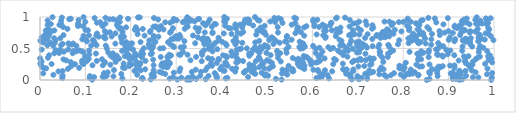
| Category | Series 0 |
|---|---|
| 0.8517453043884555 | 0.001 |
| 0.993865788818756 | 0.002 |
| 0.92421928301429 | 0.003 |
| 0.11494246304169853 | 0.004 |
| 0.3285292895966484 | 0.005 |
| 0.5321813494685641 | 0.006 |
| 0.3229325201346477 | 0.007 |
| 0.302608369958298 | 0.008 |
| 0.24389420201860312 | 0.009 |
| 0.33215628549919063 | 0.01 |
| 0.6871110966097197 | 0.011 |
| 0.9302765382753684 | 0.012 |
| 0.3648677871262077 | 0.013 |
| 0.7031395950889501 | 0.014 |
| 0.9167529244467799 | 0.015 |
| 0.3437675871711281 | 0.016 |
| 0.8578641617673483 | 0.017 |
| 0.909330148688486 | 0.018 |
| 0.5196457296687454 | 0.019 |
| 0.7206491587617166 | 0.02 |
| 0.22575723154965877 | 0.021 |
| 0.7004841224084475 | 0.022 |
| 0.28545039676317974 | 0.023 |
| 0.6859710154661992 | 0.024 |
| 0.40898410668095664 | 0.025 |
| 0.6366075065044474 | 0.026 |
| 0.18144309309771067 | 0.027 |
| 0.2253442996594589 | 0.028 |
| 0.3266540526623384 | 0.029 |
| 0.22532012384857325 | 0.03 |
| 0.04909111847365333 | 0.031 |
| 0.6089509980509238 | 0.032 |
| 0.10944485526205705 | 0.033 |
| 0.7081152089598097 | 0.034 |
| 0.41265247078994116 | 0.035 |
| 0.326502487703038 | 0.036 |
| 0.31155835153600264 | 0.037 |
| 0.3900845507603692 | 0.038 |
| 0.9951365960320512 | 0.039 |
| 0.7000949159336126 | 0.04 |
| 0.9656442115044974 | 0.041 |
| 0.2932435445535486 | 0.042 |
| 0.9097209442566069 | 0.043 |
| 0.953526477979759 | 0.044 |
| 0.6154370346867435 | 0.045 |
| 0.11921774569219423 | 0.046 |
| 0.4583504453000835 | 0.047 |
| 0.38874175025968705 | 0.048 |
| 0.9092881677238172 | 0.049 |
| 0.14197114880470418 | 0.05 |
| 0.8015277027395885 | 0.051 |
| 0.1379742821688561 | 0.052 |
| 0.7631484658734377 | 0.053 |
| 0.6215446508254242 | 0.054 |
| 0.3362144057127442 | 0.055 |
| 0.25137238048844224 | 0.056 |
| 0.6832175226085327 | 0.057 |
| 0.16176303529499425 | 0.058 |
| 0.9153271086545628 | 0.059 |
| 0.04939699108425355 | 0.06 |
| 0.6991657838963681 | 0.061 |
| 0.10992623036283078 | 0.062 |
| 0.8757834314876418 | 0.063 |
| 0.37122003114018576 | 0.064 |
| 0.14666623247337784 | 0.065 |
| 0.9383055412388116 | 0.066 |
| 0.35292586224719247 | 0.067 |
| 0.5025105134567361 | 0.068 |
| 0.24765535994239163 | 0.069 |
| 0.49556725616449626 | 0.07 |
| 0.04963036342068994 | 0.071 |
| 0.8331053564657009 | 0.072 |
| 0.38855071208946657 | 0.073 |
| 0.7726529252482564 | 0.074 |
| 0.6836705415293377 | 0.075 |
| 0.9164078356537823 | 0.076 |
| 0.6333871359024557 | 0.077 |
| 0.9214349944376365 | 0.078 |
| 0.6193285089730441 | 0.079 |
| 0.7582664450957158 | 0.08 |
| 0.8337066675031387 | 0.081 |
| 0.02945636184849587 | 0.082 |
| 0.21404832447852962 | 0.083 |
| 0.7214362234436708 | 0.084 |
| 0.5445885781950225 | 0.085 |
| 0.7945553811251855 | 0.086 |
| 0.2459135148980186 | 0.087 |
| 0.8065434694518768 | 0.088 |
| 0.49801356042071176 | 0.089 |
| 0.7473919147595646 | 0.09 |
| 0.6820197896780943 | 0.091 |
| 0.9845888788939088 | 0.092 |
| 0.9266204216189156 | 0.093 |
| 0.8143037410660731 | 0.094 |
| 0.17913733900560536 | 0.095 |
| 0.2757149401635759 | 0.096 |
| 0.4741672761175343 | 0.097 |
| 0.623556885583387 | 0.098 |
| 0.6742327299339196 | 0.099 |
| 0.7163947268998733 | 0.1 |
| 0.858798388194862 | 0.101 |
| 0.8206473603723144 | 0.102 |
| 0.90474743954678 | 0.103 |
| 0.5328401438740826 | 0.104 |
| 0.0069907391539003605 | 0.105 |
| 0.4717456545098735 | 0.106 |
| 0.8117565405555062 | 0.107 |
| 0.7797079850323674 | 0.108 |
| 0.1410349163908866 | 0.109 |
| 0.3850093604360786 | 0.11 |
| 0.9958022682757366 | 0.111 |
| 0.25076016268575607 | 0.112 |
| 0.2688574653285526 | 0.113 |
| 0.4883384171491766 | 0.114 |
| 0.8748438480139572 | 0.115 |
| 0.536447011978435 | 0.116 |
| 0.2947447035333367 | 0.117 |
| 0.7287263575406195 | 0.118 |
| 0.45003939600097687 | 0.119 |
| 0.9090856752959029 | 0.12 |
| 0.14923186142259504 | 0.121 |
| 0.449099533680383 | 0.122 |
| 0.959530948792269 | 0.123 |
| 0.9259103211263985 | 0.124 |
| 0.8571197183514976 | 0.125 |
| 0.8252122234316427 | 0.126 |
| 0.334516466980018 | 0.127 |
| 0.7337987593767781 | 0.128 |
| 0.26376134649312966 | 0.129 |
| 0.3546446994677328 | 0.13 |
| 0.4658407327462296 | 0.131 |
| 0.7251796242352492 | 0.132 |
| 0.6134232663272333 | 0.133 |
| 0.4299943990891284 | 0.134 |
| 0.9232718291191485 | 0.135 |
| 0.04060039866555276 | 0.136 |
| 0.30723595647312485 | 0.137 |
| 0.6435875162381278 | 0.138 |
| 0.5579698461319373 | 0.139 |
| 0.5554950924025235 | 0.14 |
| 0.6900779902654501 | 0.141 |
| 0.049779985027784246 | 0.142 |
| 0.9371118064537067 | 0.143 |
| 0.45306018827701733 | 0.144 |
| 0.40631409173471156 | 0.145 |
| 0.20827281256735297 | 0.146 |
| 0.9241893031351218 | 0.147 |
| 0.8746863226148994 | 0.148 |
| 0.4038634629540728 | 0.149 |
| 0.9512623776802573 | 0.15 |
| 0.7252678734355699 | 0.151 |
| 0.21048445975838714 | 0.152 |
| 0.22200347781933316 | 0.153 |
| 0.25023603087060065 | 0.154 |
| 0.6276530638252004 | 0.155 |
| 0.3646315067168018 | 0.156 |
| 0.7477093217544335 | 0.157 |
| 0.16297072428352832 | 0.158 |
| 0.6119008932091055 | 0.159 |
| 0.5434199388751852 | 0.16 |
| 0.6701138072761015 | 0.161 |
| 0.800762514751559 | 0.162 |
| 0.6021972131502253 | 0.163 |
| 0.342995433480931 | 0.164 |
| 0.5340914158019616 | 0.165 |
| 0.8166658459910288 | 0.166 |
| 0.6902273949085764 | 0.167 |
| 0.6755579696268829 | 0.168 |
| 0.7568471383203016 | 0.169 |
| 0.23179771321626697 | 0.17 |
| 0.6676091282195278 | 0.171 |
| 0.863855125046963 | 0.172 |
| 0.5565223807049762 | 0.173 |
| 0.39696131348305963 | 0.174 |
| 0.5821528847675291 | 0.175 |
| 0.46071057344700217 | 0.176 |
| 0.061534768893486635 | 0.177 |
| 0.42297785597279514 | 0.178 |
| 0.5046006350390657 | 0.179 |
| 0.9857272787058831 | 0.18 |
| 0.47257174712908634 | 0.181 |
| 0.49434978549856323 | 0.182 |
| 0.30902205041318853 | 0.183 |
| 0.8750371583140831 | 0.184 |
| 0.013658743605752921 | 0.185 |
| 0.7914732308922076 | 0.186 |
| 0.4320449073057687 | 0.187 |
| 0.008970724156752485 | 0.188 |
| 0.18664617545825268 | 0.189 |
| 0.2142968059949657 | 0.19 |
| 0.46145617773425374 | 0.191 |
| 0.08614549029059448 | 0.192 |
| 0.9129897474972999 | 0.193 |
| 0.47066706704100625 | 0.194 |
| 0.9478014455350394 | 0.195 |
| 0.4705591925378666 | 0.196 |
| 0.8028442840359784 | 0.197 |
| 0.18250545812799612 | 0.198 |
| 0.5765085353361644 | 0.199 |
| 0.7517067691414523 | 0.2 |
| 0.8814035605255347 | 0.201 |
| 0.3687697347786577 | 0.202 |
| 0.2795042117843559 | 0.203 |
| 0.4830280090182404 | 0.204 |
| 0.8809661852977303 | 0.205 |
| 0.5089372409821162 | 0.206 |
| 0.28127939402459523 | 0.207 |
| 0.27181629159929255 | 0.208 |
| 0.004598876051149836 | 0.209 |
| 0.399539586434713 | 0.21 |
| 0.4674678691483706 | 0.211 |
| 0.7984328466401487 | 0.212 |
| 0.8777590887496296 | 0.213 |
| 0.8358174798540239 | 0.214 |
| 0.7013743023642558 | 0.215 |
| 0.8416994434721975 | 0.216 |
| 0.06808269980572523 | 0.217 |
| 0.5130658117684528 | 0.218 |
| 0.5712432642789642 | 0.219 |
| 0.8871211925144941 | 0.22 |
| 0.9121659937714616 | 0.221 |
| 0.7143595076368432 | 0.222 |
| 0.19626892979918698 | 0.223 |
| 0.5475687565175202 | 0.224 |
| 0.3789292357138778 | 0.225 |
| 0.7915863194293621 | 0.226 |
| 0.4131434930642154 | 0.227 |
| 0.2671809423657181 | 0.228 |
| 0.9032649993850639 | 0.229 |
| 0.5826253389041661 | 0.23 |
| 0.9129649838336187 | 0.231 |
| 0.4696184523479181 | 0.232 |
| 0.11559074025231886 | 0.233 |
| 0.13832272240999632 | 0.234 |
| 0.2503018072698795 | 0.235 |
| 0.21918901910211797 | 0.236 |
| 0.1996426505013973 | 0.237 |
| 0.9437285865101503 | 0.238 |
| 0.001954564240659873 | 0.239 |
| 0.7271649788096826 | 0.24 |
| 0.40937883242637085 | 0.241 |
| 0.15508482605915375 | 0.242 |
| 0.9525263688978476 | 0.243 |
| 0.8291384162325475 | 0.244 |
| 0.597572800242674 | 0.245 |
| 0.4613406260756546 | 0.246 |
| 0.8578637751291933 | 0.247 |
| 0.2104049132093816 | 0.248 |
| 0.4889884984842596 | 0.249 |
| 0.213509863218746 | 0.25 |
| 0.07696959060780717 | 0.251 |
| 0.645933380431601 | 0.252 |
| 0.09566569589454599 | 0.253 |
| 0.025508172362300408 | 0.254 |
| 0.7300824875511148 | 0.255 |
| 0.9804822579056163 | 0.256 |
| 0.5676952590257902 | 0.257 |
| 0.37663205889677576 | 0.258 |
| 0.6670929569891763 | 0.259 |
| 0.272448439558608 | 0.26 |
| 0.18426397723466093 | 0.261 |
| 0.28613330150576266 | 0.262 |
| 0.269178337242568 | 0.263 |
| 0.49068043785674353 | 0.264 |
| 0.0008326777397732466 | 0.265 |
| 0.9381126361374765 | 0.266 |
| 0.22123199650404435 | 0.267 |
| 0.09316161136361256 | 0.268 |
| 0.40985023036488955 | 0.269 |
| 0.38929201679018155 | 0.27 |
| 0.5108328752689597 | 0.271 |
| 0.1983577251210128 | 0.272 |
| 0.2760890428813646 | 0.273 |
| 0.8056801504442324 | 0.274 |
| 0.49242347379151685 | 0.275 |
| 0.40808245911069385 | 0.276 |
| 0.6080500454214679 | 0.277 |
| 0.4323444789345331 | 0.278 |
| 0.995897581454332 | 0.279 |
| 0.579169472712929 | 0.28 |
| 0.1433790261039949 | 0.281 |
| 0.28463588703495557 | 0.282 |
| 0.06787227714625832 | 0.283 |
| 0.612014684040998 | 0.284 |
| 0.6878495769646876 | 0.285 |
| 0.27922323623688616 | 0.286 |
| 0.16646649421566417 | 0.287 |
| 0.7561212226686601 | 0.288 |
| 0.4357265880974299 | 0.289 |
| 0.953676608620065 | 0.29 |
| 0.9363499220211987 | 0.291 |
| 0.595618942420327 | 0.292 |
| 0.00351325898234367 | 0.293 |
| 0.5302470919954062 | 0.294 |
| 0.21187668174881613 | 0.295 |
| 0.5058768493250365 | 0.296 |
| 0.1028113427869689 | 0.297 |
| 0.9366088680917545 | 0.298 |
| 0.35623606578353606 | 0.299 |
| 0.4754450283703897 | 0.3 |
| 0.44721360474620087 | 0.301 |
| 0.5967280336393567 | 0.302 |
| 0.12510935264301692 | 0.303 |
| 0.23232875530882546 | 0.304 |
| 0.6166742329254657 | 0.305 |
| 0.09277882543571214 | 0.306 |
| 0.6916251590409732 | 0.307 |
| 0.5737174976840068 | 0.308 |
| 0.9222094730532454 | 0.309 |
| 0.5714995000327197 | 0.31 |
| 0.05797720296705822 | 0.311 |
| 0.4377831535465243 | 0.312 |
| 0.3313631936402033 | 0.313 |
| 0.6997549327370304 | 0.314 |
| 0.5002385418050923 | 0.315 |
| 0.7176420854394447 | 0.316 |
| 0.6518295544728188 | 0.317 |
| 0.7073706362485489 | 0.318 |
| 0.9881143961208959 | 0.319 |
| 0.8327622975833122 | 0.32 |
| 0.5653755449436457 | 0.321 |
| 0.39351600038414936 | 0.322 |
| 0.729666999317735 | 0.323 |
| 0.24927379480094647 | 0.324 |
| 0.7305833907020541 | 0.325 |
| 0.37580073336857356 | 0.326 |
| 0.051679051573914836 | 0.327 |
| 0.4847661148714646 | 0.328 |
| 0.13673788732400127 | 0.329 |
| 0.839440962946891 | 0.33 |
| 0.9599982012571102 | 0.331 |
| 0.37914977844271447 | 0.332 |
| 0.6479591372660694 | 0.333 |
| 0.3931678875618292 | 0.334 |
| 0.10729444214845096 | 0.335 |
| 0.7054816594872233 | 0.336 |
| 0.5693077854442035 | 0.337 |
| 0.5917052557925441 | 0.338 |
| 0.17418251165269427 | 0.339 |
| 0.735168793289276 | 0.34 |
| 0.20248535037775195 | 0.341 |
| 0.9943837736311691 | 0.342 |
| 0.6269242180621734 | 0.343 |
| 0.00030708035594506633 | 0.344 |
| 0.9364250802280607 | 0.345 |
| 0.170899909408478 | 0.346 |
| 0.3701875268575784 | 0.347 |
| 0.726565363581869 | 0.348 |
| 0.5569021510531219 | 0.349 |
| 0.19565575160129411 | 0.35 |
| 0.4331098864491528 | 0.351 |
| 0.5243163141143872 | 0.352 |
| 0.017560291308549858 | 0.353 |
| 0.16142525051507062 | 0.354 |
| 0.8341942822576454 | 0.355 |
| 0.9638097116301011 | 0.356 |
| 0.5818067084635468 | 0.357 |
| 0.20088005200959513 | 0.358 |
| 0.7541016646607976 | 0.359 |
| 0.41150237071013185 | 0.36 |
| 0.22450242564001566 | 0.361 |
| 0.2817874402893087 | 0.362 |
| 0.48205900899241916 | 0.363 |
| 0.8561157422640411 | 0.364 |
| 0.7660806022539711 | 0.365 |
| 0.26600077375331377 | 0.366 |
| 0.3438036809822176 | 0.367 |
| 0.5866230698528845 | 0.368 |
| 0.28080836053728264 | 0.369 |
| 0.6772148097931474 | 0.37 |
| 0.9689256037251596 | 0.371 |
| 0.8874529078229136 | 0.372 |
| 0.6132065462838256 | 0.373 |
| 0.2104488880744131 | 0.374 |
| 0.9338195976688842 | 0.375 |
| 0.09921034558236252 | 0.376 |
| 0.9871433985984759 | 0.377 |
| 0.9437805957350961 | 0.378 |
| 0.1869333410824685 | 0.379 |
| 0.40993087831146524 | 0.38 |
| 0.5810446156274532 | 0.381 |
| 0.1957522081875661 | 0.382 |
| 0.4610718554658435 | 0.383 |
| 0.1951922198042998 | 0.384 |
| 0.16913762745291994 | 0.385 |
| 0.15545865512212975 | 0.386 |
| 0.4229387678375349 | 0.387 |
| 0.2884886494471042 | 0.388 |
| 0.8859666535369916 | 0.389 |
| 0.9910477339203166 | 0.39 |
| 0.4033924575427471 | 0.391 |
| 0.02002314477023326 | 0.392 |
| 0.9125362422951312 | 0.393 |
| 0.6180523699782434 | 0.394 |
| 0.508025166313851 | 0.395 |
| 0.6676820736263018 | 0.396 |
| 0.22023028046670323 | 0.397 |
| 0.8770054061296702 | 0.398 |
| 0.3570743510752856 | 0.399 |
| 0.30915680493979547 | 0.4 |
| 0.3249458893864654 | 0.401 |
| 0.28474250572188553 | 0.402 |
| 0.7486437614571091 | 0.403 |
| 0.30653821979173024 | 0.404 |
| 0.8745801890501137 | 0.405 |
| 0.10868705864919315 | 0.406 |
| 0.46217669795507943 | 0.407 |
| 0.8978998412649344 | 0.408 |
| 0.46340879527486567 | 0.409 |
| 0.5238305156375835 | 0.41 |
| 0.24393147649253855 | 0.411 |
| 0.19276363722355294 | 0.412 |
| 0.8350357686761273 | 0.413 |
| 0.22710108813845697 | 0.414 |
| 0.4320978955860091 | 0.415 |
| 0.7167871187558552 | 0.416 |
| 0.831008450647048 | 0.417 |
| 0.7667315427534968 | 0.418 |
| 0.2094448114351053 | 0.419 |
| 0.12317712500342515 | 0.42 |
| 0.4605834607757029 | 0.421 |
| 0.1605060094930142 | 0.422 |
| 0.24648570990098428 | 0.423 |
| 0.4656183751696059 | 0.424 |
| 0.07210712975271882 | 0.425 |
| 0.03147150059232462 | 0.426 |
| 0.5289692151893223 | 0.427 |
| 0.8418120680912788 | 0.428 |
| 0.6073784253307285 | 0.429 |
| 0.04240761932412651 | 0.43 |
| 0.49868470181054125 | 0.431 |
| 0.5431063397778947 | 0.432 |
| 0.7705334433316852 | 0.433 |
| 0.48320969376794165 | 0.434 |
| 0.8447902149794452 | 0.435 |
| 0.040875009467682744 | 0.436 |
| 0.15041251299981717 | 0.437 |
| 0.6979919489817505 | 0.438 |
| 0.8559301113177047 | 0.439 |
| 0.7028267968339439 | 0.44 |
| 0.35655590362409295 | 0.441 |
| 0.09565757746101322 | 0.442 |
| 0.6609326137702987 | 0.443 |
| 0.9665625743935485 | 0.444 |
| 0.3146412629025527 | 0.445 |
| 0.7491136584085564 | 0.446 |
| 0.8140785338863843 | 0.447 |
| 0.42162419590221034 | 0.448 |
| 0.05252666859973476 | 0.449 |
| 0.6999374843628808 | 0.45 |
| 0.6221474370065542 | 0.451 |
| 0.748199518289935 | 0.452 |
| 0.22399124974384121 | 0.453 |
| 0.3799283092687894 | 0.454 |
| 0.8393926162202446 | 0.455 |
| 0.08001414481222602 | 0.456 |
| 0.9851598066654862 | 0.457 |
| 0.09084699527792917 | 0.458 |
| 0.671880151761659 | 0.459 |
| 0.07376923027454951 | 0.46 |
| 0.522334365649787 | 0.461 |
| 0.18073142452889635 | 0.462 |
| 0.6720920545647849 | 0.463 |
| 0.9298820681377832 | 0.464 |
| 0.6789109072577786 | 0.465 |
| 0.7777592307602141 | 0.466 |
| 0.6562511371530709 | 0.467 |
| 0.9038598399555052 | 0.468 |
| 0.10825103042663387 | 0.469 |
| 0.08634013135829699 | 0.47 |
| 0.4777634780545307 | 0.471 |
| 0.8567208118156737 | 0.472 |
| 0.3615435615116743 | 0.473 |
| 0.19058962134031465 | 0.474 |
| 0.03438246965246394 | 0.475 |
| 0.1878934972108428 | 0.476 |
| 0.7736547427724363 | 0.477 |
| 0.044079946027680394 | 0.478 |
| 0.8948700859521993 | 0.479 |
| 0.4335226018935596 | 0.48 |
| 0.8746136980035731 | 0.481 |
| 0.4693643546294557 | 0.482 |
| 0.0036355775327039375 | 0.483 |
| 0.06212504807799624 | 0.484 |
| 0.20491592545195558 | 0.485 |
| 0.8724297229246539 | 0.486 |
| 0.5424337537367181 | 0.487 |
| 0.48739319001900305 | 0.488 |
| 0.3905892536419334 | 0.489 |
| 0.4389256644273938 | 0.49 |
| 0.6397351051483442 | 0.491 |
| 0.47260735977275803 | 0.492 |
| 0.24602535667239178 | 0.493 |
| 0.6888870863136132 | 0.494 |
| 0.3720110307088047 | 0.495 |
| 0.44288272430343767 | 0.496 |
| 0.9673694064057733 | 0.497 |
| 0.6070973944398484 | 0.498 |
| 0.5734581231834522 | 0.499 |
| 0.14731544520406514 | 0.5 |
| 0.2646381392618522 | 0.501 |
| 0.5786504080011606 | 0.502 |
| 0.45571880999994874 | 0.503 |
| 0.22886390407469792 | 0.504 |
| 0.271605492747805 | 0.505 |
| 0.707880826374047 | 0.506 |
| 0.19899518321519183 | 0.507 |
| 0.6752111773271591 | 0.508 |
| 0.6455445923189882 | 0.509 |
| 0.2473337633581757 | 0.51 |
| 0.9766449178617749 | 0.511 |
| 0.6156232059694602 | 0.512 |
| 0.501821449912593 | 0.513 |
| 0.7201162776642914 | 0.514 |
| 0.3774679931196686 | 0.515 |
| 0.8794325780565151 | 0.516 |
| 0.24081973064179585 | 0.517 |
| 0.49107985542649657 | 0.518 |
| 0.30982736430082647 | 0.519 |
| 0.47342016736370884 | 0.52 |
| 0.6351068594251971 | 0.521 |
| 0.7452276403861989 | 0.522 |
| 0.2949147475182913 | 0.523 |
| 0.4851118232280036 | 0.524 |
| 0.5713424836335745 | 0.525 |
| 0.5472506670501434 | 0.526 |
| 0.3169178548850259 | 0.527 |
| 0.7028867756967428 | 0.528 |
| 0.1879264123633243 | 0.529 |
| 0.5832958257407035 | 0.53 |
| 0.9518855260379103 | 0.531 |
| 0.930740559947115 | 0.532 |
| 0.24917912073604054 | 0.533 |
| 0.7689547670371173 | 0.534 |
| 0.5008678066420285 | 0.535 |
| 0.8882869747025028 | 0.536 |
| 0.7325998991218062 | 0.537 |
| 0.29316384665723727 | 0.538 |
| 0.24651487147989326 | 0.539 |
| 0.9694237742515879 | 0.54 |
| 0.6014868273519943 | 0.541 |
| 0.08015761738324567 | 0.542 |
| 0.698585930873471 | 0.543 |
| 0.7169869970518016 | 0.544 |
| 0.14483422645813382 | 0.545 |
| 0.11284518642010155 | 0.546 |
| 0.028840005226022702 | 0.547 |
| 0.6612950828690614 | 0.548 |
| 0.6675455563074575 | 0.549 |
| 0.4110343950626024 | 0.55 |
| 0.016107301954984776 | 0.551 |
| 0.494817939316754 | 0.552 |
| 0.3811192976189801 | 0.553 |
| 0.1244441191806055 | 0.554 |
| 0.04657986823528004 | 0.555 |
| 0.8798535403600599 | 0.556 |
| 0.5778942134287554 | 0.557 |
| 0.7671144554677498 | 0.558 |
| 0.8616665082036786 | 0.559 |
| 0.7473073611173269 | 0.56 |
| 0.36955507566427026 | 0.561 |
| 0.06996447186776555 | 0.562 |
| 0.24011788175558235 | 0.563 |
| 0.4306019083032703 | 0.564 |
| 0.6820808168671932 | 0.565 |
| 0.28707142560639587 | 0.566 |
| 0.2397372911118557 | 0.567 |
| 0.7884938782210855 | 0.568 |
| 0.06411757914697958 | 0.569 |
| 0.36192216448095615 | 0.57 |
| 0.5143079022219594 | 0.571 |
| 0.7109294132454396 | 0.572 |
| 0.9473098156333676 | 0.573 |
| 0.0497428629935428 | 0.574 |
| 0.1969568004438489 | 0.575 |
| 0.5800851272545913 | 0.576 |
| 0.16600816385011552 | 0.577 |
| 0.40875998947876735 | 0.578 |
| 0.07319887968267458 | 0.579 |
| 0.8494585917532902 | 0.58 |
| 0.062484829414146015 | 0.581 |
| 0.20282483484365643 | 0.582 |
| 0.834279034416278 | 0.583 |
| 0.3418171657057475 | 0.584 |
| 0.8118201704606531 | 0.585 |
| 0.8772401748003761 | 0.586 |
| 0.032466877355306845 | 0.587 |
| 0.576478794423853 | 0.588 |
| 0.12018444542877094 | 0.589 |
| 0.4455939891559785 | 0.59 |
| 0.5278892882799041 | 0.591 |
| 0.3866031202135125 | 0.592 |
| 0.18085237477979266 | 0.593 |
| 0.8329104855428212 | 0.594 |
| 0.02213754496431264 | 0.595 |
| 0.006738247896837635 | 0.596 |
| 0.4741562544702629 | 0.597 |
| 0.6969963364296277 | 0.598 |
| 0.36207789194126894 | 0.599 |
| 0.28209744279685056 | 0.6 |
| 0.22142474097867737 | 0.601 |
| 0.18988555836172227 | 0.602 |
| 0.8382905402956078 | 0.603 |
| 0.5434485434293512 | 0.604 |
| 0.25422738609470574 | 0.605 |
| 0.40122593745786417 | 0.606 |
| 0.9374142461268189 | 0.607 |
| 0.43372143068915914 | 0.608 |
| 0.5720038052597862 | 0.609 |
| 0.7028069400325491 | 0.61 |
| 0.5400519272577187 | 0.611 |
| 0.3717388851607407 | 0.612 |
| 0.10328053287884031 | 0.613 |
| 0.9652481716577067 | 0.614 |
| 0.9129340859134596 | 0.615 |
| 0.9473157212572164 | 0.616 |
| 0.3180534559466789 | 0.617 |
| 0.4261913404376939 | 0.618 |
| 0.6641104139349548 | 0.619 |
| 0.5196577060253375 | 0.62 |
| 0.4828523358466309 | 0.621 |
| 0.6852317491620784 | 0.622 |
| 0.11832448787877214 | 0.623 |
| 0.0009455910754426755 | 0.624 |
| 0.8191375926535486 | 0.625 |
| 0.9666332823533353 | 0.626 |
| 0.8307054779306327 | 0.627 |
| 0.2406847755564262 | 0.628 |
| 0.3945911448818539 | 0.629 |
| 0.9312052463201501 | 0.63 |
| 0.7911699807197691 | 0.631 |
| 0.03416058769245245 | 0.632 |
| 0.9987152248462428 | 0.633 |
| 0.11648879450241478 | 0.634 |
| 0.5048227328138738 | 0.635 |
| 0.2480458683494734 | 0.636 |
| 0.9003601849319268 | 0.637 |
| 0.10158972608192429 | 0.638 |
| 0.6596809882474246 | 0.639 |
| 0.5542470379537423 | 0.64 |
| 0.8242300068630218 | 0.641 |
| 0.9796712508998099 | 0.642 |
| 0.941250161492341 | 0.643 |
| 0.013171032154900453 | 0.644 |
| 0.09323339407074505 | 0.645 |
| 0.3569006138856693 | 0.646 |
| 0.8618822018614906 | 0.647 |
| 0.9145814654789598 | 0.648 |
| 0.2893875052623821 | 0.649 |
| 0.5152973264704942 | 0.65 |
| 0.7319592318763748 | 0.651 |
| 0.17929157710217725 | 0.652 |
| 0.2943252157692853 | 0.653 |
| 0.3687996717062576 | 0.654 |
| 0.3050085666481329 | 0.655 |
| 0.9375020030364362 | 0.656 |
| 0.9722420037939367 | 0.657 |
| 0.5067526031152362 | 0.658 |
| 0.8112707836805411 | 0.659 |
| 0.14402957748745915 | 0.66 |
| 0.8480633334857897 | 0.661 |
| 0.044690371779997906 | 0.662 |
| 0.3004831485426218 | 0.663 |
| 0.03109900953224254 | 0.664 |
| 0.9488442684903383 | 0.665 |
| 0.36051539198167604 | 0.666 |
| 0.7160058617658946 | 0.667 |
| 0.628579013734063 | 0.668 |
| 0.7501431515416762 | 0.669 |
| 0.9658199788214067 | 0.67 |
| 0.3930509861268664 | 0.671 |
| 0.016946696850648757 | 0.672 |
| 0.14123536123553015 | 0.673 |
| 0.4314019519600042 | 0.674 |
| 0.3478962231418944 | 0.675 |
| 0.0036596637759456208 | 0.676 |
| 0.902571821266433 | 0.677 |
| 0.5103547236856396 | 0.678 |
| 0.7605231653529145 | 0.679 |
| 0.3093499469754908 | 0.68 |
| 0.25034822440981075 | 0.681 |
| 0.5436791390296685 | 0.682 |
| 0.29728409032928926 | 0.683 |
| 0.8276664462813486 | 0.684 |
| 0.7558111860508 | 0.685 |
| 0.6293066790337688 | 0.686 |
| 0.26080558119678754 | 0.687 |
| 0.1848543883253656 | 0.688 |
| 0.12927803679973981 | 0.689 |
| 0.1779165968147136 | 0.69 |
| 0.1579679549483859 | 0.691 |
| 0.14138652486123804 | 0.692 |
| 0.7689840323646577 | 0.693 |
| 0.2993587574052684 | 0.694 |
| 0.8185464307726497 | 0.695 |
| 0.6515945016959807 | 0.696 |
| 0.9928618738050913 | 0.697 |
| 0.5441056374164199 | 0.698 |
| 0.25071905617252643 | 0.699 |
| 0.09580594546127308 | 0.7 |
| 0.7408514221554708 | 0.701 |
| 0.6849649821070454 | 0.702 |
| 0.5819484126958169 | 0.703 |
| 0.23027602346880127 | 0.704 |
| 0.12413799115157809 | 0.705 |
| 0.336962332977907 | 0.706 |
| 0.8448179601806967 | 0.707 |
| 0.10762327834547059 | 0.708 |
| 0.9695680869865683 | 0.709 |
| 0.6238644523882757 | 0.71 |
| 0.6809184192396476 | 0.711 |
| 0.05180707599660195 | 0.712 |
| 0.9254332345576983 | 0.713 |
| 0.7419570826616251 | 0.714 |
| 0.8807839413189357 | 0.715 |
| 0.30718842638014354 | 0.716 |
| 0.49738843775216424 | 0.717 |
| 0.02052615425483395 | 0.718 |
| 0.011386134742598197 | 0.719 |
| 0.47631805853592957 | 0.72 |
| 0.74994204447893 | 0.721 |
| 0.7037080320844968 | 0.722 |
| 0.6093264410537046 | 0.723 |
| 0.760927116191924 | 0.724 |
| 0.692916260805477 | 0.725 |
| 0.9662768905214063 | 0.726 |
| 0.7216178180212945 | 0.727 |
| 0.21506666314636602 | 0.728 |
| 0.8353190415842072 | 0.729 |
| 0.6861100245508509 | 0.73 |
| 0.8633803481652416 | 0.731 |
| 0.421890120624565 | 0.732 |
| 0.9878119902863768 | 0.733 |
| 0.7784608390013853 | 0.734 |
| 0.8219324980168815 | 0.735 |
| 0.44250047293171957 | 0.736 |
| 0.6530026846340535 | 0.737 |
| 0.12566732692439742 | 0.738 |
| 0.4048630858188381 | 0.739 |
| 0.9814683478515446 | 0.74 |
| 0.16622893314557974 | 0.741 |
| 0.5627262601673224 | 0.742 |
| 0.379891761080942 | 0.743 |
| 0.837452016940031 | 0.744 |
| 0.843709754984803 | 0.745 |
| 0.014523411853033852 | 0.746 |
| 0.9093139213076815 | 0.747 |
| 0.4355945348431214 | 0.748 |
| 0.14602800601153776 | 0.749 |
| 0.4929077507553914 | 0.75 |
| 0.28654912352249784 | 0.751 |
| 0.8913274832856332 | 0.752 |
| 0.5242569705893848 | 0.753 |
| 0.9467170339237749 | 0.754 |
| 0.3630086783201779 | 0.755 |
| 0.9277716842661429 | 0.756 |
| 0.38014761811207964 | 0.757 |
| 0.1539317968705315 | 0.758 |
| 0.5746726897892502 | 0.759 |
| 0.18195176221819764 | 0.76 |
| 0.49419160531225925 | 0.761 |
| 0.242447333032909 | 0.762 |
| 0.755362289483452 | 0.763 |
| 0.4475443956994569 | 0.764 |
| 0.7701230849180414 | 0.765 |
| 0.6609785387581957 | 0.766 |
| 0.9464835054370832 | 0.767 |
| 0.34865548629159704 | 0.768 |
| 0.9588775942337783 | 0.769 |
| 0.28872603696050914 | 0.77 |
| 0.7960441901127125 | 0.771 |
| 0.9485500827086766 | 0.772 |
| 0.48756413264110654 | 0.773 |
| 0.025298197527361843 | 0.774 |
| 0.8798431961381644 | 0.775 |
| 0.8997325559692148 | 0.776 |
| 0.14272126203172386 | 0.777 |
| 0.2432996989586289 | 0.778 |
| 0.6258455606133887 | 0.779 |
| 0.629600566390022 | 0.78 |
| 0.5663283089500996 | 0.781 |
| 0.49061092474568024 | 0.782 |
| 0.47858197001481473 | 0.783 |
| 0.012691343861166215 | 0.784 |
| 0.9341949096354246 | 0.785 |
| 0.03162666675454817 | 0.786 |
| 0.6893494122559497 | 0.787 |
| 0.642815336188989 | 0.788 |
| 0.10574742581498164 | 0.789 |
| 0.7068780001409712 | 0.79 |
| 0.812831612606401 | 0.791 |
| 0.7668710964587101 | 0.792 |
| 0.10028472076310124 | 0.793 |
| 0.9356701800267528 | 0.794 |
| 0.2144762136582139 | 0.795 |
| 0.7816128091357631 | 0.796 |
| 0.8349733382476784 | 0.797 |
| 0.20890757486699152 | 0.798 |
| 0.26191310672504253 | 0.799 |
| 0.01689409527940855 | 0.8 |
| 0.9894300382764964 | 0.801 |
| 0.2721439797609002 | 0.802 |
| 0.8316504883088821 | 0.803 |
| 0.7642864201026749 | 0.804 |
| 0.6533722322075556 | 0.805 |
| 0.8573275793018424 | 0.806 |
| 0.018621003180407936 | 0.807 |
| 0.9291916720871468 | 0.808 |
| 0.9642012998071824 | 0.809 |
| 0.22640201643687463 | 0.81 |
| 0.06042991568591116 | 0.811 |
| 0.9282770236297015 | 0.812 |
| 0.31888528114186 | 0.813 |
| 0.7313328863330513 | 0.814 |
| 0.1753871258573344 | 0.815 |
| 0.43153416634583475 | 0.816 |
| 0.17951928459764188 | 0.817 |
| 0.3509647801374104 | 0.818 |
| 0.4201394263916627 | 0.819 |
| 0.7008280040766885 | 0.82 |
| 0.6282277158932219 | 0.821 |
| 0.9875158327290907 | 0.822 |
| 0.2928164314599788 | 0.823 |
| 0.9183190746973138 | 0.824 |
| 0.5666914731935067 | 0.825 |
| 0.4155225197998579 | 0.826 |
| 0.8133488341184913 | 0.827 |
| 0.4858957626200291 | 0.828 |
| 0.7340402824581136 | 0.829 |
| 0.3428634168704422 | 0.83 |
| 0.4862126210125527 | 0.831 |
| 0.6619319123170264 | 0.832 |
| 0.5691452761348491 | 0.833 |
| 0.5817968330409257 | 0.834 |
| 0.4454849280116049 | 0.835 |
| 0.18973140895692153 | 0.836 |
| 0.21103019224907926 | 0.837 |
| 0.8531657793072817 | 0.838 |
| 0.173990437535276 | 0.839 |
| 0.5235531420188709 | 0.84 |
| 0.6147499630188624 | 0.841 |
| 0.05081644866167567 | 0.842 |
| 0.9131230588613993 | 0.843 |
| 0.25449278582247215 | 0.844 |
| 0.3786925068199415 | 0.845 |
| 0.24996313052696162 | 0.846 |
| 0.3252977691913608 | 0.847 |
| 0.43081871051488607 | 0.848 |
| 0.6819262912411984 | 0.849 |
| 0.25491595242378207 | 0.85 |
| 0.17136427447739278 | 0.851 |
| 0.09541287229831985 | 0.852 |
| 0.6283445464381695 | 0.853 |
| 0.5867837803864073 | 0.854 |
| 0.6043310897517037 | 0.855 |
| 0.26619293552433754 | 0.856 |
| 0.13741662635893082 | 0.857 |
| 0.08367341998040134 | 0.858 |
| 0.8089789066099824 | 0.859 |
| 0.494577402937586 | 0.86 |
| 0.32372918759381253 | 0.861 |
| 0.4077450118310053 | 0.862 |
| 0.9134353054031705 | 0.863 |
| 0.13793756178219163 | 0.864 |
| 0.4695157020115279 | 0.865 |
| 0.924342208936134 | 0.866 |
| 0.3646325560790985 | 0.867 |
| 0.6386998469195553 | 0.868 |
| 0.732205496292241 | 0.869 |
| 0.08652854370814234 | 0.87 |
| 0.7747534641571202 | 0.871 |
| 0.6045960845737403 | 0.872 |
| 0.8357606519321188 | 0.873 |
| 0.042764200715106004 | 0.874 |
| 0.016814137610767443 | 0.875 |
| 0.7194506393749566 | 0.876 |
| 0.16933892894569913 | 0.877 |
| 0.5544423735205575 | 0.878 |
| 0.6225805079146168 | 0.879 |
| 0.4409449868600074 | 0.88 |
| 0.9843499952106023 | 0.881 |
| 0.43020541172186244 | 0.882 |
| 0.8887017966852121 | 0.883 |
| 0.9461416439926607 | 0.884 |
| 0.38715819483438274 | 0.885 |
| 0.9649142693281042 | 0.886 |
| 0.44839488331269506 | 0.887 |
| 0.04667718836859114 | 0.888 |
| 0.023856504222501407 | 0.889 |
| 0.3843120224683547 | 0.89 |
| 0.9608266017460396 | 0.891 |
| 0.8304015912235432 | 0.892 |
| 0.08364518632392348 | 0.893 |
| 0.9304295234168375 | 0.894 |
| 0.14409940448087022 | 0.895 |
| 0.9736515800777392 | 0.896 |
| 0.6903713237008992 | 0.897 |
| 0.9621046942427998 | 0.898 |
| 0.777625301468838 | 0.899 |
| 0.3593160592300697 | 0.9 |
| 0.8281453742768794 | 0.901 |
| 0.5624764764606364 | 0.902 |
| 0.4600329168297529 | 0.903 |
| 0.6975340091911982 | 0.904 |
| 0.9869008226052159 | 0.905 |
| 0.5340481899321468 | 0.906 |
| 0.6412406140775025 | 0.907 |
| 0.6419071675788193 | 0.908 |
| 0.1254831963038342 | 0.909 |
| 0.2868484943267582 | 0.91 |
| 0.3696794318793669 | 0.911 |
| 0.9675908280449501 | 0.912 |
| 0.9395994076158631 | 0.913 |
| 0.8728393547871903 | 0.914 |
| 0.4079665598958917 | 0.915 |
| 0.2757531048256626 | 0.916 |
| 0.1325904101119233 | 0.917 |
| 0.3146772324328104 | 0.918 |
| 0.7906269708846372 | 0.919 |
| 0.5178559207510821 | 0.92 |
| 0.8002482031625696 | 0.921 |
| 0.09972449084126878 | 0.922 |
| 0.1756256039088382 | 0.923 |
| 0.8166584242562037 | 0.924 |
| 0.7027872129325213 | 0.925 |
| 0.7699233207575669 | 0.926 |
| 0.7588672019847605 | 0.927 |
| 0.6020075230298989 | 0.928 |
| 0.5074774456164874 | 0.929 |
| 0.7173030393639138 | 0.93 |
| 0.3404674828115979 | 0.931 |
| 0.9848623797059106 | 0.932 |
| 0.45101908739637453 | 0.933 |
| 0.4059134952294966 | 0.934 |
| 0.9293963154588519 | 0.935 |
| 0.29317645709077145 | 0.936 |
| 0.32843150484423367 | 0.937 |
| 0.31937008436882885 | 0.938 |
| 0.04644751427723259 | 0.939 |
| 0.9700107665451003 | 0.94 |
| 0.6023414308163186 | 0.941 |
| 0.8394286686590591 | 0.942 |
| 0.48336067847087105 | 0.943 |
| 0.33379308950571973 | 0.944 |
| 0.01673464977663086 | 0.945 |
| 0.46131347288119473 | 0.946 |
| 0.16835839358763616 | 0.947 |
| 0.30128328255513914 | 0.948 |
| 0.8095530963752408 | 0.949 |
| 0.48001358410773576 | 0.95 |
| 0.8428945480315244 | 0.951 |
| 0.08490419156691575 | 0.952 |
| 0.5163803392806209 | 0.953 |
| 0.6823083375145432 | 0.954 |
| 0.9589128936324885 | 0.955 |
| 0.610854174346824 | 0.956 |
| 0.6019496454617713 | 0.957 |
| 0.45220091314536626 | 0.958 |
| 0.37361593820207195 | 0.959 |
| 0.2602770307004769 | 0.96 |
| 0.9343610226749444 | 0.961 |
| 0.4580246952793038 | 0.962 |
| 0.15333427235395125 | 0.963 |
| 0.32916407089927213 | 0.964 |
| 0.16107486901337553 | 0.965 |
| 0.06443801937905724 | 0.966 |
| 0.5304122215453377 | 0.967 |
| 0.34858966392423696 | 0.968 |
| 0.35051708119104985 | 0.969 |
| 0.29478209560464597 | 0.97 |
| 0.1938252713062104 | 0.971 |
| 0.06797173957652025 | 0.972 |
| 0.41162345567233016 | 0.973 |
| 0.8100561211209673 | 0.974 |
| 0.9400276219396909 | 0.975 |
| 0.5640825034093193 | 0.976 |
| 0.8697031585523973 | 0.977 |
| 0.9821082956898156 | 0.978 |
| 0.6521610164077717 | 0.979 |
| 0.9924868286199867 | 0.98 |
| 0.5251631391674803 | 0.981 |
| 0.8983995816447882 | 0.982 |
| 0.12033607428316784 | 0.983 |
| 0.2511381078126165 | 0.984 |
| 0.5163429430144256 | 0.985 |
| 0.8554301800199654 | 0.986 |
| 0.14424559546324722 | 0.987 |
| 0.5602637811906676 | 0.988 |
| 0.6537436953817808 | 0.989 |
| 0.6718562210464485 | 0.99 |
| 0.048083451909732844 | 0.991 |
| 0.17628652567368785 | 0.992 |
| 0.21599164037504703 | 0.993 |
| 0.21974927725219817 | 0.994 |
| 0.9618936723245205 | 0.995 |
| 0.32443470635053817 | 0.996 |
| 0.027524218566616243 | 0.997 |
| 0.09591703670204965 | 0.998 |
| 0.47360033375321875 | 0.999 |
| 0.40592078042689606 | 1 |